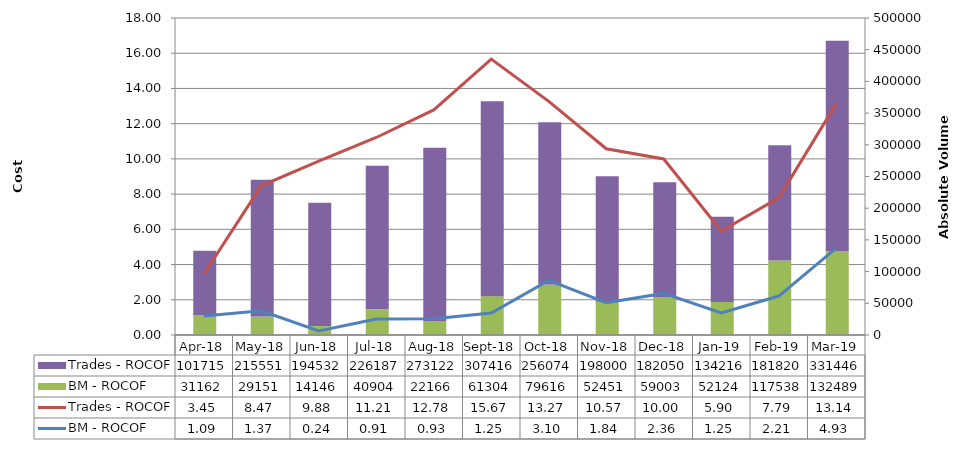
| Category | BM - ROCOF | Trades - ROCOF |
|---|---|---|
| 0 | 31162.47 | 101715 |
| 1900-01-01 | 29151.454 | 215551 |
| 1900-01-02 | 14146.085 | 194531.5 |
| 1900-01-03 | 40904.042 | 226187 |
| 1900-01-04 | 22166.055 | 273122 |
| 1900-01-05 | 61303.894 | 307416 |
| 1900-01-06 | 79615.596 | 256073.5 |
| 1900-01-07 | 52451.07 | 198000.36 |
| 1900-01-08 | 59003.106 | 182049.5 |
| 1900-01-09 | 52123.797 | 134216 |
| 1900-01-10 | 117538.323 | 181819.8 |
| 1900-01-11 | 132488.81 | 331445.5 |